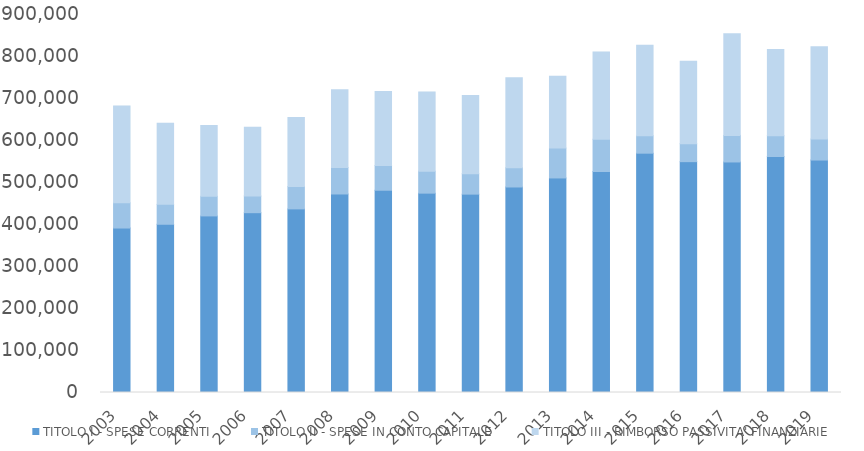
| Category | TITOLO I - SPESE CORRENTI | TITOLO II - SPESE IN CONTO CAPITALE | TITOLO III - RIMBORSO PASSIVITA' FINANZIARIE |
|---|---|---|---|
| 2003.0 | 391593 | 60035 | 230794 |
| 2004.0 | 400561 | 47364 | 192929 |
| 2005.0 | 420449 | 46794 | 168313 |
| 2006.0 | 428139 | 39854 | 163620 |
| 2007.0 | 437189 | 53157 | 164199 |
| 2008.0 | 472685.151 | 63051.551 | 184807.79 |
| 2009.0 | 481578.263 | 58913.343 | 176141.241 |
| 2010.0 | 474662.182 | 52282.257 | 188435.487 |
| 2011.0 | 472319.774 | 48502.102 | 186135.302 |
| 2012.0 | 489350.589 | 45653.028 | 214333.651 |
| 2013.0 | 510835.178 | 71174.832 | 170972.576 |
| 2014.0 | 526195.115 | 76830.108 | 207562.179 |
| 2015.0 | 569801.099 | 41309.734 | 215519.974 |
| 2016.0 | 549647.209 | 42794.164 | 195981.732 |
| 2017.0 | 548889.873 | 63180.565 | 242072.352 |
| 2018.0 | 561969.187 | 49628.079 | 205104.26 |
| 2019.0 | 553480.387 | 49806.254 | 219891.145 |